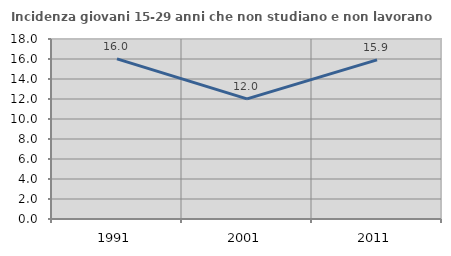
| Category | Incidenza giovani 15-29 anni che non studiano e non lavorano  |
|---|---|
| 1991.0 | 16.008 |
| 2001.0 | 12.008 |
| 2011.0 | 15.912 |